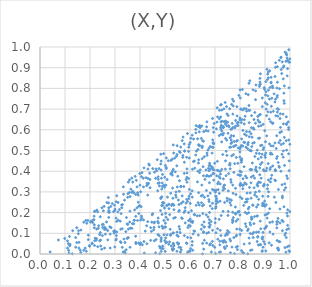
| Category | Series 0 |
|---|---|
| 0.8310107770279482 | 0.001 |
| 0.898913810847134 | 0.596 |
| 0.6540510691226347 | 0.104 |
| 0.3874631804725965 | 0.222 |
| 0.6546207538727327 | 0.238 |
| 0.5547162914851463 | 0.051 |
| 0.7137941692079827 | 0.403 |
| 0.9398200858943669 | 0.734 |
| 0.3341971248897787 | 0.289 |
| 0.849325830463019 | 0.439 |
| 0.9521932139375623 | 0.172 |
| 0.4832545874102593 | 0.482 |
| 0.8845274134972081 | 0.366 |
| 0.9255671018323791 | 0.713 |
| 0.8330063047213393 | 0.12 |
| 0.7443946813726824 | 0.378 |
| 0.580040295929516 | 0.209 |
| 0.4129959694963846 | 0.366 |
| 0.2143592115713148 | 0.165 |
| 0.7431489190879789 | 0.057 |
| 0.27392977666990687 | 0.247 |
| 0.6291189782104226 | 0.184 |
| 0.3923141950374478 | 0.285 |
| 0.5480994509107668 | 0.48 |
| 0.475970111480921 | 0.413 |
| 0.778710897008461 | 0.436 |
| 0.9074800867668688 | 0.414 |
| 0.9037776620426404 | 0.128 |
| 0.7702806819108841 | 0.748 |
| 0.8894891133310451 | 0.234 |
| 0.902071237305825 | 0.542 |
| 0.6762399553611516 | 0.253 |
| 0.7959046290315613 | 0.766 |
| 0.8063001542431134 | 0.016 |
| 0.7995433114804191 | 0.4 |
| 0.5044821907666558 | 0.178 |
| 0.8877825379417206 | 0.526 |
| 0.9592627329327018 | 0.059 |
| 0.9218647605759679 | 0.348 |
| 0.31314582801352503 | 0.163 |
| 0.48806872565542664 | 0.191 |
| 0.5532084250079843 | 0.085 |
| 0.6346657429753184 | 0.296 |
| 0.5873736780547346 | 0.051 |
| 0.6345669806234511 | 0.528 |
| 0.7998804199698862 | 0.657 |
| 0.7414811162366485 | 0.628 |
| 0.6562707594658288 | 0.155 |
| 0.8279009361200589 | 0.252 |
| 0.4900773159576684 | 0.248 |
| 0.49239196022669435 | 0.248 |
| 0.4160103909899449 | 0.416 |
| 0.959775182891374 | 0.218 |
| 0.9649558132031538 | 0.891 |
| 0.45050235401471367 | 0.194 |
| 0.30456789780079735 | 0.174 |
| 0.8415299077367656 | 0.501 |
| 0.8011147144769322 | 0.754 |
| 0.8969722543994947 | 0.337 |
| 0.9728971732582194 | 0.901 |
| 0.7853067797263139 | 0.466 |
| 0.6498396132868661 | 0.233 |
| 0.7602873724734117 | 0.439 |
| 0.8254573203163951 | 0.265 |
| 0.7308539335273225 | 0.48 |
| 0.6920900001822458 | 0.389 |
| 0.46241911056471585 | 0.006 |
| 0.7595983822720573 | 0.072 |
| 0.7672013793731606 | 0.539 |
| 0.8679928045993506 | 0.333 |
| 0.6739168676081639 | 0.414 |
| 0.35333008425872686 | 0.347 |
| 0.4028701660838291 | 0.164 |
| 0.8544608049566019 | 0.105 |
| 0.8316969790569037 | 0.527 |
| 0.8065929921884155 | 0.114 |
| 0.7323330656259425 | 0.206 |
| 0.7089510329999497 | 0.706 |
| 0.525741750297624 | 0.234 |
| 0.8789379566468505 | 0.818 |
| 0.8711829305682173 | 0.342 |
| 0.9464603138654758 | 0.461 |
| 0.8808273798991788 | 0.159 |
| 0.9774131302801313 | 0.563 |
| 0.48878923274467956 | 0.326 |
| 0.7926032203062251 | 0.205 |
| 0.976044360381164 | 0.228 |
| 0.784599218313341 | 0.158 |
| 0.7714492497278236 | 0.676 |
| 0.6716636666285167 | 0.281 |
| 0.6502360847395897 | 0.284 |
| 0.10988232788745472 | 0.063 |
| 0.3770361983834333 | 0.163 |
| 0.42662149881589484 | 0.136 |
| 0.8401600159463561 | 0.15 |
| 0.9835821674586454 | 0.009 |
| 0.818027853412925 | 0.579 |
| 0.6946045362454685 | 0.588 |
| 0.8433917204133137 | 0.409 |
| 0.7103591641817691 | 0.663 |
| 0.7499963302227528 | 0.113 |
| 0.7816802533556325 | 0.227 |
| 0.9473584775730104 | 0.126 |
| 0.6332073159849776 | 0.091 |
| 0.4991087076850885 | 0.37 |
| 0.7414949693387397 | 0.41 |
| 0.8954014955766977 | 0.06 |
| 0.3901637387843155 | 0.162 |
| 0.9901921086657071 | 0.937 |
| 0.4947018814057645 | 0.485 |
| 0.6194026194172059 | 0.415 |
| 0.8623691141625819 | 0.788 |
| 0.5770872422536368 | 0.389 |
| 0.8367386118886505 | 0.635 |
| 0.5085732051234282 | 0.36 |
| 0.8813974761462359 | 0.821 |
| 0.7317172944712216 | 0.308 |
| 0.9995026289255495 | 0.942 |
| 0.7323917930256091 | 0.616 |
| 0.8842106442382358 | 0.62 |
| 0.5490380500892963 | 0.324 |
| 0.14706307284675119 | 0.127 |
| 0.965806114451972 | 0.591 |
| 0.5629650631708083 | 0.516 |
| 0.4840935253730351 | 0.061 |
| 0.8677825730293205 | 0.183 |
| 0.6111828264678153 | 0.018 |
| 0.7560108065812472 | 0.105 |
| 0.6950815745393956 | 0.532 |
| 0.741667561976286 | 0.642 |
| 0.8689529449344396 | 0.502 |
| 0.7105334716028993 | 0.339 |
| 0.9134875279146011 | 0.198 |
| 0.43984963578260705 | 0.36 |
| 0.520646653030767 | 0.119 |
| 0.9084446859639543 | 0.173 |
| 0.5427308140975433 | 0.285 |
| 0.8405144866219514 | 0.408 |
| 0.2778948482536365 | 0.201 |
| 0.7545477409535902 | 0.388 |
| 0.9803553304525544 | 0.975 |
| 0.676051013252801 | 0.402 |
| 0.6247686825269998 | 0.235 |
| 0.8333847532111499 | 0.539 |
| 0.9798389407839876 | 0.031 |
| 0.4725956874228065 | 0.373 |
| 0.35023682881240153 | 0.077 |
| 0.6841654195443744 | 0.379 |
| 0.9606412670425517 | 0.549 |
| 0.8171925395227121 | 0.649 |
| 0.8652312695925554 | 0.486 |
| 0.7477672222256188 | 0.677 |
| 0.9983804236846151 | 0.927 |
| 0.7857297471928586 | 0.545 |
| 0.9272255393161296 | 0.752 |
| 0.879217293120831 | 0.045 |
| 0.9168501956318745 | 0.054 |
| 0.37117588843367755 | 0.347 |
| 0.9362388465612599 | 0.774 |
| 0.9449714545827299 | 0.509 |
| 0.37506067770157875 | 0.146 |
| 0.22062915408735126 | 0.076 |
| 0.2583084597909699 | 0.13 |
| 0.9115873891950943 | 0.687 |
| 0.726774352147922 | 0.542 |
| 0.8817553075434444 | 0.433 |
| 0.4385425575158476 | 0.39 |
| 0.2389344918217612 | 0.063 |
| 0.8039300897386377 | 0.701 |
| 0.9231592055642021 | 0.685 |
| 0.42098778710773344 | 0.11 |
| 0.8997183105528768 | 0.231 |
| 0.9533040395801105 | 0.022 |
| 0.3516914410472728 | 0.291 |
| 0.724952637820579 | 0.622 |
| 0.6258181134650945 | 0.497 |
| 0.8095165996810476 | 0.794 |
| 0.27106096071700114 | 0.068 |
| 0.7158728220097076 | 0.374 |
| 0.789866105139782 | 0.037 |
| 0.3996485300873418 | 0.046 |
| 0.7120369803900983 | 0.251 |
| 0.5533205790661023 | 0.261 |
| 0.9128522499342075 | 0.437 |
| 0.7713443699007935 | 0.611 |
| 0.6845413988958428 | 0.157 |
| 0.2622638686043595 | 0.12 |
| 0.11345961928519897 | 0.05 |
| 0.8528888573004542 | 0.079 |
| 0.48477502539693096 | 0.449 |
| 0.522939904160224 | 0.294 |
| 0.9875496673061606 | 0.198 |
| 0.8206240023487482 | 0.665 |
| 0.7811119521231195 | 0.617 |
| 0.8031293933495766 | 0.38 |
| 0.29994180232330625 | 0.217 |
| 0.5328841448667194 | 0.239 |
| 0.9737978798216494 | 0.534 |
| 0.5309927796124574 | 0.018 |
| 0.6473111218992716 | 0.333 |
| 0.5477458565248681 | 0.013 |
| 0.7315978598934199 | 0.575 |
| 0.7172416947766216 | 0.293 |
| 0.535784255026323 | 0.214 |
| 0.9757967156219038 | 0.741 |
| 0.3807228403256542 | 0.375 |
| 0.6370256151977932 | 0.237 |
| 0.48553321565942525 | 0.366 |
| 0.899670384112283 | 0.048 |
| 0.8952561896358671 | 0.241 |
| 0.8077899506593306 | 0.65 |
| 0.499325156905437 | 0.065 |
| 0.29491346139124913 | 0.109 |
| 0.4310247360817207 | 0.285 |
| 0.985156885218273 | 0.08 |
| 0.5033674877336057 | 0.054 |
| 0.5052461924916255 | 0.464 |
| 0.18524999832942735 | 0.013 |
| 0.8450414376254943 | 0.372 |
| 0.3945082054217518 | 0.053 |
| 0.8439169276649254 | 0.344 |
| 0.7193705397979018 | 0.044 |
| 0.5973887623320678 | 0.015 |
| 0.9239099799512799 | 0.522 |
| 0.5329950253519143 | 0.527 |
| 0.6230409072046375 | 0.602 |
| 0.8069689888433891 | 0.46 |
| 0.5688820297506891 | 0.548 |
| 0.8921633736213997 | 0.104 |
| 0.7827587847772335 | 0.193 |
| 0.6763549033122983 | 0.15 |
| 0.14260642284132147 | 0.079 |
| 0.6086768993685662 | 0.574 |
| 0.8571878037474389 | 0.539 |
| 0.09907804745453262 | 0.075 |
| 0.8407549490183095 | 0.295 |
| 0.950178271335745 | 0.028 |
| 0.7721584476403046 | 0.159 |
| 0.7095821221805166 | 0.448 |
| 0.5651725371380057 | 0.02 |
| 0.4764219467353296 | 0.131 |
| 0.5328176261599242 | 0.052 |
| 0.8882721222144766 | 0.482 |
| 0.724676572609142 | 0.186 |
| 0.30650866921777864 | 0.157 |
| 0.8987105589142876 | 0.255 |
| 0.9097804920680542 | 0.843 |
| 0.2528829802531208 | 0.143 |
| 0.7597314991413845 | 0.248 |
| 0.9886636845234973 | 0.861 |
| 0.873976438663284 | 0.559 |
| 0.11595444398909581 | 0.005 |
| 0.7883020107388226 | 0.632 |
| 0.26602965230152803 | 0.155 |
| 0.8721580116718245 | 0.238 |
| 0.49547877918275396 | 0.093 |
| 0.8361248692064682 | 0.226 |
| 0.5959564175699555 | 0.28 |
| 0.9739760310212294 | 0.629 |
| 0.616940306494386 | 0.191 |
| 0.7469357563131004 | 0.038 |
| 0.2422460849715825 | 0.067 |
| 0.5579404538444357 | 0.354 |
| 0.8390702050578648 | 0.694 |
| 0.6123282612237908 | 0.097 |
| 0.8733390790903882 | 0.044 |
| 0.5066675684986752 | 0.233 |
| 0.8928028797079975 | 0.626 |
| 0.5159165593780775 | 0.219 |
| 0.973412932401149 | 0.498 |
| 0.2962741728043718 | 0.101 |
| 0.5952746428904127 | 0.138 |
| 0.1608799764873733 | 0.019 |
| 0.8168996226560781 | 0.628 |
| 0.29745095348371525 | 0.106 |
| 0.9245184466311898 | 0.853 |
| 0.44572023070721084 | 0.109 |
| 0.48796400169357695 | 0.135 |
| 0.36770618352587797 | 0.124 |
| 0.47273329109977374 | 0.174 |
| 0.9307612166754332 | 0.804 |
| 0.6385553789337394 | 0.621 |
| 0.8361604875694886 | 0.077 |
| 0.5480952965117812 | 0.106 |
| 0.42411137940018234 | 0.368 |
| 0.979353497777742 | 0.091 |
| 0.21901994107908018 | 0.064 |
| 0.990233539932957 | 0.896 |
| 0.5570619922365317 | 0.303 |
| 0.4277107512166789 | 0.049 |
| 0.8559674730150292 | 0.65 |
| 0.9860596251479657 | 0.626 |
| 0.941967630428643 | 0.748 |
| 0.9239644284349605 | 0.826 |
| 0.3598551763916441 | 0.207 |
| 0.8800819617058032 | 0.831 |
| 0.5723234606246189 | 0.565 |
| 0.22686710677309113 | 0.12 |
| 0.6920989914803042 | 0.536 |
| 0.5973925477637794 | 0.312 |
| 0.9647423907510517 | 0.529 |
| 0.8787018227650137 | 0.56 |
| 0.7707294375334107 | 0.202 |
| 0.11875841689782897 | 0.04 |
| 0.7987651789249822 | 0.12 |
| 0.26311228611493914 | 0.123 |
| 0.8357995431627917 | 0.717 |
| 0.9171722605909588 | 0.652 |
| 0.868676827957605 | 0.06 |
| 0.8024046958732404 | 0.341 |
| 0.749937616714364 | 0.093 |
| 0.75861364309273 | 0.515 |
| 0.29946956491571797 | 0.21 |
| 0.6303042974092957 | 0.557 |
| 0.4426821438034973 | 0.066 |
| 0.7820985669663144 | 0.317 |
| 0.7135820946078818 | 0.347 |
| 0.38263105935895414 | 0.086 |
| 0.577666237432893 | 0.089 |
| 0.9928372839313657 | 0.639 |
| 0.6955460769990373 | 0.388 |
| 0.9581088258550733 | 0.798 |
| 0.5183940812617381 | 0.059 |
| 0.6655599960809735 | 0.307 |
| 0.530291145724821 | 0.318 |
| 0.5610258677446649 | 0.49 |
| 0.8505502119942417 | 0.236 |
| 0.3484943293593561 | 0.146 |
| 0.8831921095688857 | 0.122 |
| 0.13063840018600253 | 0.113 |
| 0.8521740466276149 | 0.236 |
| 0.72232360397711 | 0.719 |
| 0.727274911807432 | 0.695 |
| 0.9469645070313905 | 0.571 |
| 0.21825279882837856 | 0.041 |
| 0.859202207237307 | 0.684 |
| 0.9870197331873705 | 0.962 |
| 0.6538518158103037 | 0.107 |
| 0.4337780605240297 | 0.341 |
| 0.6776653697656364 | 0.344 |
| 0.507340403325938 | 0.057 |
| 0.9478457852277057 | 0.802 |
| 0.6091619561932633 | 0.06 |
| 0.3509698254813633 | 0.143 |
| 0.9643359628872321 | 0.951 |
| 0.8478584686017823 | 0.02 |
| 0.33259372507377705 | 0.009 |
| 0.85304804654503 | 0.378 |
| 0.6899711205564897 | 0.245 |
| 0.8443710630418527 | 0.269 |
| 0.43087552476878466 | 0.156 |
| 0.7367890288640014 | 0.332 |
| 0.6460245307777702 | 0.248 |
| 0.9956331902126067 | 0.016 |
| 0.3049819633635724 | 0.072 |
| 0.3706019974507442 | 0.303 |
| 0.6381310569431831 | 0.393 |
| 0.995100712558046 | 0.987 |
| 0.7723665054234549 | 0.293 |
| 0.35871891826285596 | 0.154 |
| 0.6900684817154815 | 0.312 |
| 0.9963353475863782 | 0.039 |
| 0.4561677710182015 | 0.15 |
| 0.9836175759458071 | 0.931 |
| 0.4284427746212669 | 0.342 |
| 0.44689996623253503 | 0.154 |
| 0.23108159156773128 | 0.035 |
| 0.9938478332823799 | 0.122 |
| 0.6099351785126065 | 0.41 |
| 0.8164316022576554 | 0.048 |
| 0.4904965146743663 | 0.234 |
| 0.6410758474255532 | 0.613 |
| 0.8964615308727321 | 0.401 |
| 0.8527648917119955 | 0.609 |
| 0.9900531914794362 | 0.365 |
| 0.7406179762417536 | 0.732 |
| 0.25817852666073116 | 0.029 |
| 0.9494258949175433 | 0.905 |
| 0.9943886227475242 | 0.611 |
| 0.9033939244150223 | 0.015 |
| 0.6547449210043459 | 0.023 |
| 0.9113545963476143 | 0.764 |
| 0.27082496950937235 | 0.113 |
| 0.9490435311890456 | 0.471 |
| 0.7217071986924564 | 0.01 |
| 0.9983016975639671 | 0.012 |
| 0.4266266145861076 | 0.33 |
| 0.5019506027130485 | 0.149 |
| 0.3070021048702466 | 0.282 |
| 0.3447187817375542 | 0.02 |
| 0.7468702455111048 | 0.636 |
| 0.19785572997682532 | 0.041 |
| 0.9693888221752059 | 0.28 |
| 0.9065047094431337 | 0.668 |
| 0.30559778803542215 | 0.089 |
| 0.5873443892619231 | 0.37 |
| 0.9333348442392351 | 0.689 |
| 0.3299746527824436 | 0.239 |
| 0.383387497260428 | 0.056 |
| 0.48492599425427385 | 0.013 |
| 0.8456766905505483 | 0.178 |
| 0.6987181326093905 | 0.032 |
| 0.863544110865237 | 0.405 |
| 0.9770771971878065 | 0.309 |
| 0.7378939025125608 | 0.333 |
| 0.530542159209399 | 0.023 |
| 0.7896782764209068 | 0.021 |
| 0.5551542608140299 | 0.206 |
| 0.9285699495049295 | 0.482 |
| 0.14286855470328114 | 0.033 |
| 0.21945135763071502 | 0.206 |
| 0.5223671747783936 | 0.09 |
| 0.6884787424965289 | 0.487 |
| 0.39078277990317384 | 0.296 |
| 0.6175349040413168 | 0.449 |
| 0.9396977996085155 | 0.536 |
| 0.534623621317967 | 0.488 |
| 0.9241207479653942 | 0.365 |
| 0.7562303848822599 | 0.614 |
| 0.711224023466346 | 0.072 |
| 0.539080291009705 | 0.463 |
| 0.30350240768409364 | 0.067 |
| 0.2993756330037467 | 0.034 |
| 0.929816078206872 | 0.811 |
| 0.32893979727556627 | 0.032 |
| 0.6680046981408732 | 0.488 |
| 0.7226916777363558 | 0.612 |
| 0.5312277922331927 | 0.101 |
| 0.36007160756903805 | 0.032 |
| 0.3697550531453885 | 0.147 |
| 0.7667725908887244 | 0.474 |
| 0.9770708519712423 | 0.728 |
| 0.7748776897212478 | 0.57 |
| 0.2734273601999626 | 0.273 |
| 0.7041614128043884 | 0.229 |
| 0.8560902067362796 | 0.603 |
| 0.6474676827866299 | 0.619 |
| 0.7399050672302835 | 0.027 |
| 0.2790036531104797 | 0.131 |
| 0.9107057009006483 | 0.869 |
| 0.6867776317978763 | 0.422 |
| 0.21072056072947867 | 0.151 |
| 0.8778205691298012 | 0.81 |
| 0.8930344390333194 | 0.505 |
| 0.8348396489269954 | 0.199 |
| 0.5752710972714691 | 0.326 |
| 0.7471417820622401 | 0.619 |
| 0.3269350573609103 | 0.224 |
| 0.9852357943608395 | 0.663 |
| 0.9032441983688767 | 0.488 |
| 0.3228825869000042 | 0.12 |
| 0.3852176013366169 | 0.356 |
| 0.8509596774779628 | 0.535 |
| 0.9574570293711969 | 0.419 |
| 0.27511175463249776 | 0.21 |
| 0.7771158249459279 | 0.521 |
| 0.8623892261526903 | 0.409 |
| 0.7582988836898985 | 0.264 |
| 0.8757577289800369 | 0.639 |
| 0.8107675022804448 | 0.521 |
| 0.6800125170505277 | 0.428 |
| 0.6659383715268737 | 0.376 |
| 0.2086899353400684 | 0.049 |
| 0.9419732951993085 | 0.354 |
| 0.7823165022489852 | 0.645 |
| 0.7052523261326812 | 0.254 |
| 0.8162791977047019 | 0.422 |
| 0.31775897782419177 | 0.215 |
| 0.43124173396204746 | 0.336 |
| 0.9048306018041802 | 0.238 |
| 0.35767431068738775 | 0.297 |
| 0.6787377126766595 | 0.044 |
| 0.7042962507731515 | 0.279 |
| 0.941128506758718 | 0.407 |
| 0.46909230194818624 | 0.456 |
| 0.7980065261822203 | 0.381 |
| 0.6763749368297192 | 0.512 |
| 0.6686831602402417 | 0.38 |
| 0.14698793081644626 | 0.055 |
| 0.6515169434255599 | 0.195 |
| 0.9373666474346936 | 0.275 |
| 0.8815689311899267 | 0.871 |
| 0.6143169501297642 | 0.555 |
| 0.48716873863296123 | 0.313 |
| 0.8771363332615271 | 0.671 |
| 0.21549198932283975 | 0.166 |
| 0.3265002368660328 | 0.237 |
| 0.6902337534538202 | 0.418 |
| 0.7870262011079618 | 0.121 |
| 0.4401791525064672 | 0.32 |
| 0.8063016562961234 | 0.452 |
| 0.9781342185178028 | 0.428 |
| 0.8330593898638333 | 0.218 |
| 0.5773801760720908 | 0.443 |
| 0.9040595567846385 | 0.784 |
| 0.7046925669230771 | 0.243 |
| 0.485275688706641 | 0.078 |
| 0.7337209351918195 | 0.363 |
| 0.4142441855819173 | 0.165 |
| 0.24771540088240568 | 0.223 |
| 0.2413211287215189 | 0.104 |
| 0.5879117873662637 | 0.347 |
| 0.3613488955932378 | 0.125 |
| 0.8822112161977141 | 0.524 |
| 0.6083130498120184 | 0.042 |
| 0.2537338748649556 | 0.208 |
| 0.9756404184653826 | 0.777 |
| 0.9418440686800704 | 0.902 |
| 0.9077681946379917 | 0.892 |
| 0.8444328271016089 | 0.58 |
| 0.23448636372351986 | 0.137 |
| 0.7447025371878735 | 0.496 |
| 0.5490897532113325 | 0.055 |
| 0.5030736731985336 | 0.078 |
| 0.7354307681895061 | 0.701 |
| 0.9494237680468101 | 0.766 |
| 0.6816923688691929 | 0.411 |
| 0.31152157544843145 | 0.203 |
| 0.48327742066303675 | 0.268 |
| 0.6901457502901144 | 0.114 |
| 0.5687279524769671 | 0.281 |
| 0.8728614677493151 | 0.459 |
| 0.5299045808732 | 0.401 |
| 0.9492616917151503 | 0.702 |
| 0.5665794223697009 | 0.175 |
| 0.19314573584039174 | 0.069 |
| 0.9792224311163397 | 0.339 |
| 0.9223412061521098 | 0.482 |
| 0.6928676745541781 | 0.611 |
| 0.216396505196752 | 0.183 |
| 0.274939378051738 | 0.223 |
| 0.7330144530703269 | 0.322 |
| 0.6962598827652228 | 0.63 |
| 0.8970338502412343 | 0.803 |
| 0.48368850631950255 | 0.272 |
| 0.5653274743367244 | 0.245 |
| 0.762285400756871 | 0.063 |
| 0.2998189101459444 | 0.11 |
| 0.822341685012405 | 0.376 |
| 0.5457566926265096 | 0.472 |
| 0.67749820872649 | 0.166 |
| 0.8557711669066689 | 0.147 |
| 0.7587317895312122 | 0.702 |
| 0.6635625109997457 | 0.596 |
| 0.4667274369172452 | 0.402 |
| 0.9669079653194811 | 0.872 |
| 0.8879336431853783 | 0.077 |
| 0.9895678739255278 | 0.035 |
| 0.48736285701292037 | 0.276 |
| 0.5008748429295719 | 0.013 |
| 0.4723603423984109 | 0.342 |
| 0.8940550855709386 | 0.328 |
| 0.7930970444093849 | 0.637 |
| 0.19839016149536842 | 0.037 |
| 0.9299242261052334 | 0.156 |
| 0.8207368711729668 | 0.25 |
| 0.7734820705292009 | 0.176 |
| 0.7838665885742402 | 0.287 |
| 0.6781393931593421 | 0.129 |
| 0.6155961942403071 | 0.112 |
| 0.522283822823269 | 0.095 |
| 0.9001778856795233 | 0.189 |
| 0.8662639902877934 | 0.227 |
| 0.4026216218493479 | 0.301 |
| 0.5052428794360551 | 0.413 |
| 0.7653745288498834 | 0.572 |
| 0.9244109395940754 | 0.83 |
| 0.8788037618994221 | 0.416 |
| 0.9319397191967519 | 0.633 |
| 0.8302994740464755 | 0.509 |
| 0.8003838530798374 | 0.793 |
| 0.8237642289009974 | 0.516 |
| 0.7897271490719112 | 0.548 |
| 0.9224668809150526 | 0.418 |
| 0.9722528605094733 | 0.676 |
| 0.800508986087937 | 0.094 |
| 0.23857790237229817 | 0.094 |
| 0.5841877517582155 | 0.36 |
| 0.19161789634616588 | 0.162 |
| 0.7233020370011051 | 0.603 |
| 0.16305017412896436 | 0.008 |
| 0.5346231953289027 | 0.173 |
| 0.5324592170812688 | 0.026 |
| 0.7024664280460807 | 0.221 |
| 0.7419926221279237 | 0.558 |
| 0.7485385837241315 | 0.269 |
| 0.41722618347934065 | 0.004 |
| 0.378668628567752 | 0.213 |
| 0.5710264181577273 | 0.467 |
| 0.7371509277680693 | 0.066 |
| 0.858051596478115 | 0.181 |
| 0.9129585531591582 | 0.879 |
| 0.879051530604114 | 0.383 |
| 0.7179863585434241 | 0.694 |
| 0.7637545341106964 | 0.602 |
| 0.7478773598622027 | 0.476 |
| 0.6034088463593736 | 0.559 |
| 0.8593416241151269 | 0.471 |
| 0.7331013892329434 | 0.057 |
| 0.8954136788222952 | 0.514 |
| 0.6927038512649093 | 0.515 |
| 0.6573185565074774 | 0.066 |
| 0.9682425550416196 | 0.482 |
| 0.6784758747581704 | 0.439 |
| 0.7014891916638493 | 0.171 |
| 0.328971949197199 | 0.122 |
| 0.8282525818553645 | 0.294 |
| 0.955486856208673 | 0.061 |
| 0.7839528918927696 | 0.525 |
| 0.9258860055956202 | 0.042 |
| 0.6488171552405242 | 0.46 |
| 0.24675161284589595 | 0.023 |
| 0.18086311998403706 | 0.028 |
| 0.32099876357182927 | 0.159 |
| 0.9224318949337166 | 0.488 |
| 0.7931159071042841 | 0.512 |
| 0.6674631371435487 | 0.639 |
| 0.7384466544204774 | 0.249 |
| 0.8816296499369929 | 0.345 |
| 0.5081010259412233 | 0.092 |
| 0.24118804679117298 | 0.18 |
| 0.4063593861383939 | 0.174 |
| 0.7242333844621904 | 0.578 |
| 0.949382888427395 | 0.686 |
| 0.6371623707894964 | 0.59 |
| 0.5576699753262157 | 0.495 |
| 0.7710795306818927 | 0.333 |
| 0.5344899512060252 | 0.024 |
| 0.5288655780720963 | 0.024 |
| 0.22647649152468632 | 0.074 |
| 0.7282057001911577 | 0.642 |
| 0.721829003158259 | 0.386 |
| 0.4564453358473463 | 0.129 |
| 0.8302491935366648 | 0.113 |
| 0.8891968219058203 | 0.754 |
| 0.6815681438791729 | 0.52 |
| 0.8743502698854375 | 0.617 |
| 0.8500167287355727 | 0.097 |
| 0.33734435041015254 | 0.012 |
| 0.7520038514655498 | 0.583 |
| 0.3536481894787684 | 0.12 |
| 0.6106588218363763 | 0.158 |
| 0.6809181485521204 | 0.294 |
| 0.7048458977747857 | 0.309 |
| 0.4491037146113627 | 0.19 |
| 0.49529928380518756 | 0.162 |
| 0.7629240656444726 | 0.516 |
| 0.7169529977538894 | 0.572 |
| 0.8750281141554895 | 0.348 |
| 0.5562726990579163 | 0.032 |
| 0.5789940628918003 | 0.498 |
| 0.800344183935476 | 0.331 |
| 0.6099030763478587 | 0.152 |
| 0.9570604877019534 | 0.936 |
| 0.46407799032516595 | 0.07 |
| 0.8936617729251873 | 0.407 |
| 0.6408205336475691 | 0.407 |
| 0.7340638432804777 | 0.583 |
| 0.5628510898319151 | 0.031 |
| 0.5472470610929672 | 0.426 |
| 0.9034061234913908 | 0.833 |
| 0.7606475886441987 | 0.562 |
| 0.6723072360792366 | 0.179 |
| 0.9847011815270134 | 0.547 |
| 0.7773125583327491 | 0.544 |
| 0.7295999641542742 | 0.062 |
| 0.951257286656822 | 0.666 |
| 0.5904192444016824 | 0.08 |
| 0.8368219212199276 | 0.567 |
| 0.5783673214490304 | 0.497 |
| 0.511650555507889 | 0.237 |
| 0.8620745279401377 | 0.298 |
| 0.4769495412205024 | 0.344 |
| 0.6085472074896513 | 0.305 |
| 0.5026610161771184 | 0.131 |
| 0.6570584597606629 | 0.47 |
| 0.6597934452105123 | 0.36 |
| 0.6091134297616964 | 0.275 |
| 0.733224934502126 | 0.611 |
| 0.9325774100631936 | 0.522 |
| 0.5252503441961565 | 0.039 |
| 0.2575239356959542 | 0.119 |
| 0.7862957671854988 | 0.091 |
| 0.8189359230595022 | 0.539 |
| 0.4782438441090467 | 0.037 |
| 0.7739579783200724 | 0.52 |
| 0.6961656041013105 | 0.406 |
| 0.5942626822338157 | 0.495 |
| 0.35366321273031837 | 0.079 |
| 0.6346939727518032 | 0.455 |
| 0.3599193927237274 | 0.278 |
| 0.9857563063004197 | 0.964 |
| 0.49542835130233576 | 0.246 |
| 0.8393380414658137 | 0.837 |
| 0.7236535489208561 | 0.089 |
| 0.6403096931567116 | 0.611 |
| 0.8641351860251106 | 0.42 |
| 0.8213988163714318 | 0.146 |
| 0.7810806017418098 | 0.196 |
| 0.8146587196796111 | 0.235 |
| 0.7753024861692873 | 0.079 |
| 0.24933979845055365 | 0.089 |
| 0.4848256467902829 | 0.028 |
| 0.950935116806817 | 0.156 |
| 0.7632349125515868 | 0.359 |
| 0.7875531819855582 | 0.712 |
| 0.49638016004392355 | 0.129 |
| 0.4980438288515944 | 0.222 |
| 0.7167589581636458 | 0.167 |
| 0.2943303364709005 | 0.205 |
| 0.6810625426295852 | 0.141 |
| 0.6010287060553567 | 0.539 |
| 0.9202952063626678 | 0.805 |
| 0.7909970384322296 | 0.167 |
| 0.9967758449417506 | 0.403 |
| 0.8904344526150773 | 0.245 |
| 0.5716487950670943 | 0.476 |
| 0.8151735527920264 | 0.54 |
| 0.8693063201502446 | 0.184 |
| 0.7963210208021991 | 0.205 |
| 0.399170894087304 | 0.389 |
| 0.8620156007760276 | 0.632 |
| 0.1146275089799524 | 0.017 |
| 0.8050760659259099 | 0.396 |
| 0.8668762197523987 | 0.398 |
| 0.4545425820828335 | 0.116 |
| 0.7916718872350677 | 0.201 |
| 0.24298392754891146 | 0.039 |
| 0.6651672458259194 | 0.189 |
| 0.8655090264332732 | 0.105 |
| 0.7576118965497449 | 0.431 |
| 0.8773325578797859 | 0.485 |
| 0.2749026217563492 | 0.177 |
| 0.9944738481575238 | 0.484 |
| 0.11913685893264614 | 0.043 |
| 0.8192565331529212 | 0.344 |
| 0.9680646054293314 | 0.334 |
| 0.9906542597435224 | 0.138 |
| 0.6484006870205676 | 0.514 |
| 0.47360433451734646 | 0.15 |
| 0.7364598474839493 | 0.64 |
| 0.9730696432040266 | 0.846 |
| 0.595156832795216 | 0.268 |
| 0.8720121030990552 | 0.328 |
| 0.30426905009879496 | 0.252 |
| 0.7997626357508593 | 0.648 |
| 0.17511852568333347 | 0.154 |
| 0.5808249364203024 | 0.15 |
| 0.7102952144040914 | 0.122 |
| 0.5163704436691184 | 0.241 |
| 0.7679582678257174 | 0.033 |
| 0.6909677614120155 | 0.041 |
| 0.2305816976898456 | 0.204 |
| 0.6187329710655042 | 0.11 |
| 0.48305950123552993 | 0.435 |
| 0.9100229351264332 | 0.315 |
| 0.20583228946728865 | 0.159 |
| 0.9424177142007819 | 0.924 |
| 0.3671534353589231 | 0.367 |
| 0.19333315050137298 | 0.091 |
| 0.9636961312440334 | 0.4 |
| 0.7204913174097556 | 0.255 |
| 0.249295449210858 | 0.142 |
| 0.9473000611265406 | 0.144 |
| 0.8709404602227948 | 0.084 |
| 0.8247512271697007 | 0.702 |
| 0.8065540074831514 | 0.556 |
| 0.7461741728433685 | 0.712 |
| 0.4811750855510915 | 0.029 |
| 0.5603617070451238 | 0.104 |
| 0.5048107773004187 | 0.418 |
| 0.7779111396806101 | 0.002 |
| 0.393102343779676 | 0.25 |
| 0.3837891434809383 | 0.05 |
| 0.8797102109628325 | 0.848 |
| 0.6897531363084889 | 0.515 |
| 0.46418223116449436 | 0.411 |
| 0.9435038748715396 | 0.249 |
| 0.32183556085752 | 0.06 |
| 0.7920025043576326 | 0.621 |
| 0.8238673037604983 | 0.774 |
| 0.20841497712628299 | 0.053 |
| 0.59143135680277 | 0.128 |
| 0.4321595363341501 | 0.365 |
| 0.833010113805631 | 0.769 |
| 0.69030842890841 | 0.655 |
| 0.8563895578334493 | 0.32 |
| 0.5806455233373358 | 0.224 |
| 0.8116316691239254 | 0.597 |
| 0.5617525132481773 | 0.009 |
| 0.5187216546808582 | 0.19 |
| 0.7663319894068873 | 0.723 |
| 0.6818457565104995 | 0.05 |
| 0.4158085413974266 | 0.06 |
| 0.6503675381247833 | 0.051 |
| 0.22782084833173133 | 0.212 |
| 0.826200696698796 | 0.69 |
| 0.6758595185424439 | 0.131 |
| 0.8139131533990533 | 0.333 |
| 0.575999178962032 | 0.201 |
| 0.5719063786544288 | 0.252 |
| 0.7070611374832858 | 0.378 |
| 0.2807203752867712 | 0.096 |
| 0.40266765879695376 | 0.053 |
| 0.34105912553471696 | 0.005 |
| 0.7026879218386318 | 0.279 |
| 0.48418588358873116 | 0.068 |
| 0.25638409192487654 | 0.23 |
| 0.6577891287005475 | 0.131 |
| 0.9868097362227318 | 0.378 |
| 0.47198391978177967 | 0.094 |
| 0.6964099051742609 | 0.308 |
| 0.6483627857352425 | 0.141 |
| 0.7915376763963347 | 0.438 |
| 0.435356915579327 | 0.435 |
| 0.48809849109265896 | 0.029 |
| 0.5971109003645594 | 0.464 |
| 0.9963198485067687 | 0.803 |
| 0.7188425721191647 | 0.062 |
| 0.8110888155135436 | 0.007 |
| 0.7602696552099163 | 0.43 |
| 0.9872160349241456 | 0.118 |
| 0.8455412921706652 | 0.61 |
| 0.3120859804385088 | 0.249 |
| 0.5840605030525805 | 0.246 |
| 0.38324051098456857 | 0.182 |
| 0.9773616682166977 | 0.812 |
| 0.9526954431358801 | 0.442 |
| 0.5589211014054778 | 0.12 |
| 0.8384133005027437 | 0.59 |
| 0.912350696116193 | 0.278 |
| 0.8948970699921651 | 0.331 |
| 0.8710474398186325 | 0.665 |
| 0.10995014560454254 | 0.028 |
| 0.8002414837523851 | 0.334 |
| 0.9022639754244896 | 0.768 |
| 0.6326235193998899 | 0.248 |
| 0.531530660409236 | 0.269 |
| 0.6506642221209796 | 0.547 |
| 0.7016745573112483 | 0.299 |
| 0.6760611194046658 | 0.375 |
| 0.20213290063564326 | 0.154 |
| 0.48224512335006225 | 0.21 |
| 0.5292153206895478 | 0.241 |
| 0.8770638879182749 | 0.303 |
| 0.9470421615738975 | 0.156 |
| 0.9967801594474659 | 0.45 |
| 0.5628972454880211 | 0.325 |
| 0.7469210554110123 | 0.55 |
| 0.8000630120705293 | 0.509 |
| 0.7421445098786272 | 0.45 |
| 0.5113279764089231 | 0.166 |
| 0.5939773439039668 | 0.365 |
| 0.47898700150702145 | 0.001 |
| 0.6452603744649497 | 0.558 |
| 0.7052343214774639 | 0.26 |
| 0.7067356884185207 | 0.267 |
| 0.38290324130984243 | 0.288 |
| 0.720606515493309 | 0.366 |
| 0.3243356345791632 | 0.195 |
| 0.8461225398212632 | 0.167 |
| 0.8746631916689146 | 0.264 |
| 0.6669708752543292 | 0.1 |
| 0.8147441429563985 | 0.004 |
| 0.666539597880723 | 0.614 |
| 0.9139806934845582 | 0.357 |
| 0.6316208495618642 | 0.4 |
| 0.4045883904790593 | 0.228 |
| 0.26801374398210553 | 0.248 |
| 0.6779804056605166 | 0.201 |
| 0.7410192055276464 | 0.089 |
| 0.7518245829599963 | 0.186 |
| 0.8095817010161919 | 0.332 |
| 0.32414479311600336 | 0.055 |
| 0.7606870806341803 | 0.412 |
| 0.7798591574162029 | 0.61 |
| 0.2739298216795751 | 0.202 |
| 0.49581124935183396 | 0.332 |
| 0.4917229536687666 | 0.026 |
| 0.7921211533650886 | 0.382 |
| 0.3751891714470741 | 0.296 |
| 0.717672981322414 | 0.008 |
| 0.23345688617129323 | 0.124 |
| 0.5691297657478264 | 0.171 |
| 0.8452030432576629 | 0.498 |
| 0.8387372394528875 | 0.501 |
| 0.8358618261443497 | 0.824 |
| 0.8984709820596029 | 0.795 |
| 0.33321076226574786 | 0.324 |
| 0.4624384910511621 | 0.366 |
| 0.34564926093192605 | 0.176 |
| 0.9824152577484341 | 0.101 |
| 0.8911977127490565 | 0.083 |
| 0.7997312667810491 | 0.493 |
| 0.8480836282417292 | 0.171 |
| 0.8309881311933791 | 0.531 |
| 0.7902897951381489 | 0.621 |
| 0.858386816685108 | 0.366 |
| 0.7371230313332393 | 0.033 |
| 0.2174032032300324 | 0.141 |
| 0.6188515943490335 | 0.19 |
| 0.9679418684545039 | 0.163 |
| 0.7698293322802792 | 0.152 |
| 0.6338212100547546 | 0.439 |
| 0.8880066332206504 | 0.442 |
| 0.6930244470950961 | 0.538 |
| 0.7253734020856581 | 0.722 |
| 0.7753686685693959 | 0.394 |
| 0.6060387205587634 | 0.209 |
| 0.5279824884950491 | 0.391 |
| 0.2972790309167071 | 0.112 |
| 0.6752440788675181 | 0.263 |
| 0.8245358584842423 | 0.133 |
| 0.4899160417770541 | 0.385 |
| 0.3398546667868843 | 0.056 |
| 0.5289906871247779 | 0.381 |
| 0.603795657762653 | 0.157 |
| 0.8718256291677869 | 0.647 |
| 0.994309282024441 | 0.601 |
| 0.6727267051098951 | 0.594 |
| 0.45758894058333 | 0.064 |
| 0.5898326923602452 | 0.582 |
| 0.7336211023708996 | 0.612 |
| 0.9884097179676549 | 0.947 |
| 0.8079140999761636 | 0.268 |
| 0.35789582296128725 | 0.358 |
| 0.5341866117731168 | 0.048 |
| 0.8829220795209837 | 0.045 |
| 0.22522381376450787 | 0.067 |
| 0.8421481004075693 | 0.017 |
| 0.9179747065944299 | 0.748 |
| 0.5558476354250191 | 0.239 |
| 0.5768072012109967 | 0.532 |
| 0.6538164080793809 | 0.378 |
| 0.4374360880156515 | 0.429 |
| 0.5013606653967825 | 0.428 |
| 0.7678865601240836 | 0.605 |
| 0.9595093862740488 | 0.587 |
| 0.9541266397458686 | 0.699 |
| 0.8997399275779215 | 0.477 |
| 0.8411555549296996 | 0.099 |
| 0.48873898035768776 | 0.343 |
| 0.484295741063415 | 0.405 |
| 0.8035802280480985 | 0.699 |
| 0.7649500396354179 | 0.551 |
| 0.8120097474981343 | 0.695 |
| 0.4707466299455182 | 0.305 |
| 0.6500657573497444 | 0.001 |
| 0.5025552367519754 | 0.196 |
| 0.9009456238253335 | 0.731 |
| 0.1534595446596966 | 0.098 |
| 0.5478534544969538 | 0.09 |
| 0.2184161043851983 | 0.206 |
| 0.7653983849819755 | 0.26 |
| 0.9270543138031833 | 0.38 |
| 0.9634801990462528 | 0.949 |
| 0.7227572087059807 | 0.662 |
| 0.9690603454322674 | 0.928 |
| 0.3361729959081416 | 0.072 |
| 0.7745106880414278 | 0.738 |
| 0.8622624570654568 | 0.746 |
| 0.9617975206144943 | 0.612 |
| 0.5947927846748634 | 0.516 |
| 0.289211885024772 | 0.243 |
| 0.9754234869739675 | 0.909 |
| 0.594325422161787 | 0.161 |
| 0.9189331420195876 | 0.219 |
| 0.7527187740119904 | 0.669 |
| 0.827595746895046 | 0.196 |
| 0.8669043835640576 | 0.277 |
| 0.8020529065302896 | 0.335 |
| 0.44271243018463924 | 0.127 |
| 0.720995140486219 | 0.114 |
| 0.9405154579464403 | 0.403 |
| 0.040599655982496895 | 0.01 |
| 0.9062313636521603 | 0.135 |
| 0.6809854850081876 | 0.232 |
| 0.9844446884681956 | 0.971 |
| 0.7529348398233375 | 0.206 |
| 0.6538685456846468 | 0.545 |
| 0.893556838827981 | 0.234 |
| 0.9601889751495398 | 0.15 |
| 0.8422080176148001 | 0.141 |
| 0.9088220632381822 | 0.723 |
| 0.9067616153579242 | 0.192 |
| 0.3769037786762437 | 0.163 |
| 0.5037988060743898 | 0.332 |
| 0.8894090845049613 | 0.016 |
| 0.8379255259458004 | 0.051 |
| 0.533140258547826 | 0.409 |
| 0.846149632420773 | 0.668 |
| 0.9611495754354991 | 0.677 |
| 0.705619530105065 | 0.604 |
| 0.676748146630393 | 0.427 |
| 0.3492170855385087 | 0.075 |
| 0.18340139538319594 | 0.162 |
| 0.8251162210872872 | 0.337 |
| 0.9201490157329211 | 0.409 |
| 0.7235837452120679 | 0.638 |
| 0.8745592352694769 | 0.107 |
| 0.39506014650294335 | 0.196 |
| 0.6523051917395014 | 0.422 |
| 0.805738587670833 | 0.443 |
| 0.5879886851422436 | 0.411 |
| 0.7022238762211135 | 0.003 |
| 0.9486255907969307 | 0.757 |
| 0.90694749672057 | 0.571 |
| 0.9187310701196926 | 0.885 |
| 0.8311994827524144 | 0.265 |
| 0.721055977335487 | 0.399 |
| 0.5865137712336244 | 0.264 |
| 0.8586252836130629 | 0.286 |
| 0.41386320550027617 | 0.324 |
| 0.8122824966527402 | 0.364 |
| 0.7466764362609877 | 0.1 |
| 0.8898135691264557 | 0.072 |
| 0.9993483626706856 | 0.205 |
| 0.36757950557498986 | 0.298 |
| 0.7209953532817781 | 0.338 |
| 0.5858468001490945 | 0.053 |
| 0.708540022394431 | 0.404 |
| 0.8059011641812233 | 0.524 |
| 0.39442204731152747 | 0.23 |
| 0.7272253662272294 | 0.594 |
| 0.904565376646871 | 0.7 |
| 0.5236721462005055 | 0.452 |
| 0.15553552611029983 | 0.029 |
| 0.7635973035003466 | 0.236 |
| 0.9435136106880776 | 0.668 |
| 0.4317398255775534 | 0.41 |
| 0.825338044673381 | 0.573 |
| 0.847005699958952 | 0.519 |
| 0.07355209021966318 | 0.068 |
| 0.7529912466612444 | 0.305 |
| 0.6330447262156359 | 0.615 |
| 0.5642271385379939 | 0.327 |
| 0.9132684755855888 | 0.851 |
| 0.69088276861301 | 0.551 |
| 0.6001205623576931 | 0.013 |
| 0.1540795796519386 | 0.113 |
| 0.9908153330374015 | 0.213 |
| 0.7727231567103581 | 0.715 |
| 0.3382934369051657 | 0.26 |
| 0.29846778997493556 | 0.236 |
| 0.18690419976514322 | 0.148 |
| 0.9138309004642478 | 0.792 |
| 0.4058026726860286 | 0.183 |
| 0.6903732700183882 | 0.409 |
| 0.3432626158654761 | 0.108 |
| 0.6948750196209901 | 0.357 |
| 0.8710567577334711 | 0.081 |
| 0.7040625661773301 | 0.103 |
| 0.9536167037317844 | 0.312 |
| 0.7999007181768143 | 0.188 |
| 0.47294015639980175 | 0.361 |
| 0.8482644008387595 | 0.564 |
| 0.6298308861381409 | 0.348 |
| 0.8025827964659284 | 0.517 |
| 0.700697001305992 | 0.151 |
| 0.7883428829655744 | 0.667 |
| 0.4772143034961403 | 0.088 |
| 0.9863457149173361 | 0.502 |
| 0.9553925470637208 | 0.537 |
| 0.6357737954073978 | 0.524 |
| 0.799366030823947 | 0.469 |
| 0.6034358597035109 | 0.078 |
| 0.601023898494137 | 0.244 |
| 0.9695738609480349 | 0.113 |
| 0.7697174058382715 | 0.165 |
| 0.45822099402902294 | 0.154 |
| 0.9179019172643785 | 0.532 |
| 0.5511285691832971 | 0.376 |
| 0.39996930816153764 | 0.333 |
| 0.8797307768095916 | 0.637 |
| 0.8051177763397409 | 0.455 |
| 0.8884723322321875 | 0.012 |
| 0.5338305107361411 | 0.102 |
| 0.9867340847175516 | 0.63 |
| 0.9484014522174167 | 0.065 |
| 0.6009642651301527 | 0.169 |
| 0.2831818705456605 | 0.23 |
| 0.7378998327271562 | 0.315 |
| 0.35056246323613055 | 0.274 |
| 0.16367814131898145 | 0.116 |
| 0.6576143254352442 | 0.274 |
| 0.49119507550171015 | 0.124 |
| 0.5132957047307111 | 0.45 |
| 0.8520310387333575 | 0.793 |
| 0.596853521244159 | 0.529 |
| 0.7126118110340016 | 0.311 |
| 0.9993774947254163 | 0.53 |
| 0.6892334680468754 | 0.219 |
| 0.7618400220290107 | 0.006 |
| 0.6447484886022156 | 0.28 |
| 0.9194353545619915 | 0.152 |
| 0.9562316171277647 | 0.424 |
| 0.9394270912262865 | 0.358 |
| 0.7686694563794241 | 0.631 |
| 0.12029519771288615 | 0.048 |
| 0.9600822297052409 | 0.654 |
| 0.6322359983720167 | 0.505 |
| 0.7845944889912666 | 0.033 |
| 0.8166973187165705 | 0.703 |
| 0.7488350878327625 | 0.257 |
| 0.4909312583843877 | 0.038 |
| 0.7842081514865211 | 0.086 |
| 0.45797394897206545 | 0.395 |
| 0.8894732598218513 | 0.712 |
| 0.5484651357326357 | 0.523 |
| 0.5864385360443594 | 0.467 |
| 0.4709045314723142 | 0.157 |
| 0.5295839461708411 | 0.458 |
| 0.6640182229373117 | 0.406 |
| 0.88483942300226 | 0.467 |
| 0.6025583940142459 | 0.291 |
| 0.8268688594298478 | 0.368 |
| 0.8474303985801575 | 0.407 |
| 0.7644099444357813 | 0.346 |
| 0.6666415898212854 | 0.053 |
| 0.5904420729087407 | 0.009 |
| 0.6855271679886835 | 0.01 |
| 0.8053385604939031 | 0.635 |
| 0.9300932767002984 | 0.631 |
| 0.5883574090415327 | 0.391 |
| 0.5445266750135344 | 0.274 |
| 0.4094189452514596 | 0.045 |
| 0.5097800992215372 | 0.275 |
| 0.6137297115057331 | 0.447 |
| 0.5410408419006426 | 0.397 |
| 0.9497504262978572 | 0.83 |
| 0.7639151077145139 | 0.534 |
| 0.5903214475213513 | 0.254 |
| 0.1289666744133175 | 0.001 |
| 0.9426674517651213 | 0.403 |
| 0.952816083398501 | 0.028 |
| 0.9828209932171568 | 0.32 |
| 0.26134942250848986 | 0.096 |
| 0.5530371711766099 | 0.047 |
| 0.6895548299295592 | 0.061 |
| 0.6684833783654021 | 0.477 |
| 0.477275937826166 | 0.329 |
| 0.6029628744371544 | 0.026 |
| 0.6386806364906834 | 0.185 |
| 0.6547627064340265 | 0.591 |
| 0.5358135524914676 | 0.039 |
| 0.9942477587910061 | 0.928 |
| 0.5442805347637649 | 0.3 |
| 0.6243472305421374 | 0.62 |
| 0.8907977671189766 | 0.279 |
| 0.990136178357534 | 0.184 |
| 0.8349770478349112 | 0.695 |
| 0.9322102725183218 | 0.096 |
| 0.9228217506388761 | 0.639 |
| 0.9727757073747945 | 0.157 |
| 0.910555840369746 | 0.333 |
| 0.6449679806972713 | 0.119 |
| 0.9141482342442874 | 0.3 |
| 0.9696663709602434 | 0.271 |
| 0.5225738721938308 | 0.387 |
| 0.6229089028401835 | 0.478 |
| 0.38811278741812283 | 0.324 |
| 0.7270804057731207 | 0.409 |
| 0.7545467533418867 | 0.62 |
| 0.800537911814556 | 0.275 |
| 0.6235423680415132 | 0.585 |
| 0.3069019772195409 | 0.107 |
| 0.7738830870980163 | 0.48 |
| 0.8263077191290661 | 0.591 |
| 0.9400729085411009 | 0.858 |
| 0.5938346833671289 | 0.2 |
| 0.6742804959810799 | 0.104 |
| 0.7175595997009101 | 0.654 |
| 0.9947990609276577 | 0.551 |
| 0.9542716655446517 | 0.019 |
| 0.2174053654031505 | 0.127 |
| 0.9195036540455958 | 0.106 |
| 0.36325757787241225 | 0.313 |
| 0.6988830399829027 | 0.438 |
| 0.9045089204641817 | 0.402 |
| 0.6559208550991978 | 0.13 |
| 0.6494997242202474 | 0.521 |
| 0.40537965626117484 | 0.374 |
| 0.8378372263781239 | 0.322 |
| 0.5355919749214845 | 0.235 |
| 0.8985521329942121 | 0.123 |
| 0.15627710418345314 | 0.056 |
| 0.2505922977988381 | 0.128 |
| 0.541484604497322 | 0.176 |
| 0.972846392265948 | 0.468 |
| 0.40786092199120605 | 0.393 |
| 0.4865984446289796 | 0.234 |
| 0.9307067393290145 | 0.425 |
| 0.11794036468624944 | 0.085 |
| 0.638983491318396 | 0.524 |
| 0.9014618965714998 | 0.467 |
| 0.2806790749013796 | 0.029 |
| 0.8206567657401493 | 0.201 |
| 0.5576698501438467 | 0.211 |
| 0.8639496011437294 | 0.817 |
| 0.17518360245616554 | 0.018 |
| 0.45128124665687974 | 0.413 |
| 0.811449672042299 | 0.315 |
| 0.5563592732341299 | 0.133 |
| 0.515144864907019 | 0.047 |
| 0.3989510947039056 | 0.234 |
| 0.6010827423204387 | 0.135 |
| 0.8813434360628092 | 0.674 |
| 0.7078551812617698 | 0.637 |
| 0.6718990310022136 | 0.502 |
| 0.7505910671686873 | 0.637 |
| 0.49859181908765365 | 0.322 |
| 0.8919019521578438 | 0.033 |
| 0.28462383608254543 | 0.127 |